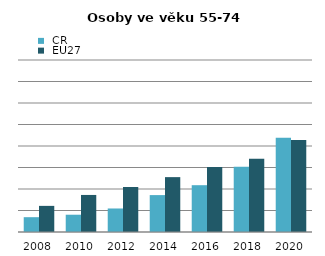
| Category |  ČR |  EU27 |
|---|---|---|
| 2008.0 | 6.89 | 12.15 |
| 2010.0 | 8.037 | 17.232 |
| 2012.0 | 10.937 | 20.923 |
| 2014.0 | 17.167 | 25.52 |
| 2016.0 | 21.771 | 30.264 |
| 2018.0 | 30.365 | 34.042 |
| 2020.0 | 43.82 | 42.842 |